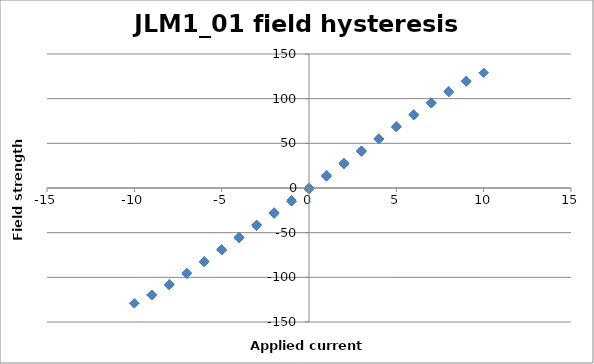
| Category | Field strength [G] |
|---|---|
| 0.0 | 0 |
| 1.0 | 13.58 |
| 2.0 | 27.22 |
| 3.0 | 41 |
| 4.0 | 54.68 |
| 5.0 | 68.19 |
| 6.0 | 81.51 |
| 7.0 | 94.72 |
| 8.0 | 107.4 |
| 9.0 | 119.13 |
| 10.0 | 128.98 |
| 9.0 | 119.87 |
| 8.0 | 108.31 |
| 7.0 | 95.62 |
| 6.0 | 82.46 |
| 5.0 | 69.1 |
| 4.0 | 55.52 |
| 3.0 | 41.85 |
| 2.0 | 28.04 |
| 1.0 | 14.28 |
| 0.0 | 0.42 |
| -1.0 | -13.46 |
| -2.0 | -27.29 |
| -3.0 | -41.13 |
| -4.0 | -54.93 |
| -5.0 | -68.56 |
| -6.0 | -81.95 |
| -7.0 | -95.08 |
| -8.0 | -107.7 |
| -9.0 | -119.32 |
| -10.0 | -129.13 |
| -9.0 | -120.24 |
| -8.0 | -108.8 |
| -7.0 | -96.14 |
| -6.0 | -83.06 |
| -5.0 | -69.68 |
| -4.0 | -56.11 |
| -3.0 | -42.45 |
| -2.0 | -28.73 |
| -1.0 | -15 |
| 0.0 | -1.18 |
| 1.0 | 12.73 |
| 2.0 | 26.58 |
| 3.0 | 40.54 |
| 4.0 | 54.35 |
| 5.0 | 68 |
| 6.0 | 81.41 |
| 7.0 | 94.63 |
| 8.0 | 107.28 |
| 9.0 | 119.01 |
| 10.0 | 128.92 |
| 9.0 | 119.85 |
| 8.0 | 108.3 |
| 7.0 | 95.63 |
| 6.0 | 82.46 |
| 5.0 | 69.08 |
| 4.0 | 55.5 |
| 3.0 | 41.84 |
| 2.0 | 28.02 |
| 1.0 | 14.26 |
| 0.0 | 0.4 |
| -1.0 | -13.47 |
| -2.0 | -27.3 |
| -3.0 | -41.17 |
| -4.0 | -54.95 |
| -5.0 | -68.6 |
| -6.0 | -82 |
| -7.0 | -95.11 |
| -8.0 | -107.73 |
| -9.0 | -119.36 |
| -10.0 | -129.11 |
| -9.0 | -120.21 |
| -8.0 | -108.77 |
| -7.0 | -96.12 |
| -6.0 | -83.04 |
| -5.0 | -69.67 |
| -4.0 | -56.08 |
| -3.0 | -42.44 |
| -2.0 | -28.74 |
| -1.0 | -14.98 |
| 0.0 | -1.17 |
| 1.0 | 12.74 |
| 2.0 | 26.59 |
| 3.0 | 40.54 |
| 4.0 | 54.35 |
| 5.0 | 68 |
| 6.0 | 81.41 |
| 7.0 | 94.62 |
| 8.0 | 107.28 |
| 9.0 | 118.99 |
| 10.0 | 128.91 |
| 9.0 | 119.84 |
| 8.0 | 108.3 |
| 7.0 | 95.62 |
| 6.0 | 82.44 |
| 5.0 | 69.08 |
| 4.0 | 55.5 |
| 3.0 | 41.83 |
| 2.0 | 28.02 |
| 1.0 | 14.27 |
| 0.0 | 0.41 |
| -1.0 | -13.47 |
| -2.0 | -27.3 |
| -3.0 | -41.16 |
| -4.0 | -54.94 |
| -5.0 | -68.6 |
| -6.0 | -82 |
| -7.0 | -95.11 |
| -8.0 | -107.72 |
| -9.0 | -119.34 |
| -10.0 | -129.1 |
| -9.0 | -120.2 |
| -8.0 | -108.76 |
| -7.0 | -96.11 |
| -6.0 | -83.03 |
| -5.0 | -69.66 |
| -4.0 | -56.08 |
| -3.0 | -42.43 |
| -2.0 | -28.72 |
| -1.0 | -14.98 |
| 0.0 | -1.16 |